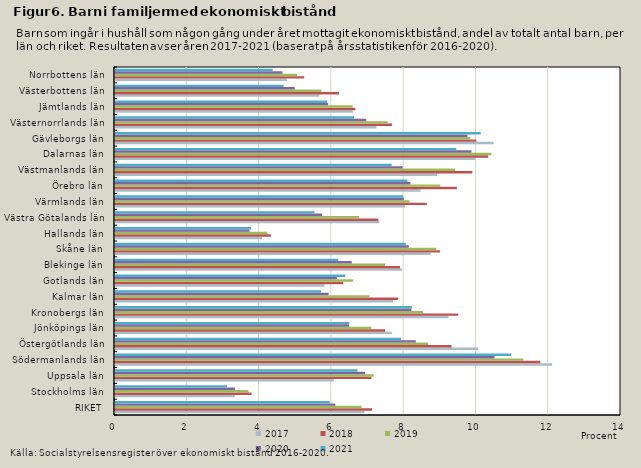
| Category | 2017 | 2018 | 2019 | 2020 | 2021 |
|---|---|---|---|---|---|
| RIKET | 6.9 | 7.114 | 6.826 | 6.097 | 5.941 |
| Stockholms län | 3.314 | 3.778 | 3.692 | 3.318 | 3.101 |
| Uppsala län | 6.054 | 7.097 | 7.156 | 6.917 | 6.707 |
| Södermanlands län | 12.095 | 11.766 | 11.297 | 10.501 | 10.955 |
| Östergötlands län | 10.047 | 9.314 | 8.664 | 8.324 | 7.92 |
| Jönköpings län | 7.656 | 7.475 | 7.092 | 6.478 | 6.483 |
| Kronobergs län | 9.229 | 9.496 | 8.52 | 8.201 | 8.214 |
| Kalmar län | 7.692 | 7.835 | 7.042 | 5.91 | 5.703 |
| Gotlands län | 5.788 | 6.316 | 6.581 | 6.137 | 6.371 |
| Blekinge län | 7.944 | 7.887 | 7.472 | 6.551 | 6.178 |
| Skåne län | 8.73 | 8.99 | 8.889 | 8.129 | 8.045 |
| Hallands län | 4.067 | 4.311 | 4.214 | 3.722 | 3.765 |
| Västra Götalands län | 7.318 | 7.287 | 6.75 | 5.729 | 5.517 |
| Värmlands län | 8.026 | 8.628 | 8.149 | 7.988 | 7.979 |
| Örebro län | 8.454 | 9.46 | 8.998 | 8.173 | 8.093 |
| Västmanlands län | 8.911 | 9.886 | 9.412 | 7.959 | 7.656 |
| Dalarnas län | 9.967 | 10.323 | 10.415 | 9.865 | 9.44 |
| Gävleborgs län | 10.475 | 9.997 | 9.829 | 9.753 | 10.119 |
| Västernorrlands län | 7.23 | 7.662 | 7.547 | 6.952 | 6.611 |
| Jämtlands län | 6.586 | 6.65 | 6.572 | 5.897 | 5.864 |
| Västerbottens län | 5.652 | 6.195 | 5.711 | 4.973 | 4.666 |
| Norrbottens län | 4.756 | 5.234 | 5.039 | 4.634 | 4.361 |